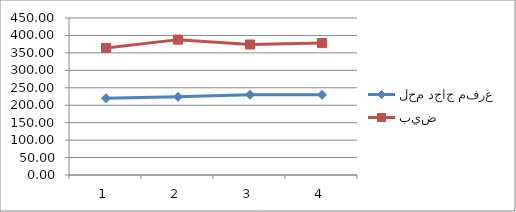
| Category | لحم دجاج مفرغ | بيض |
|---|---|---|
| 0 | 220 | 364 |
| 1 | 224 | 388 |
| 2 | 230 | 374 |
| 3 | 230 | 378 |